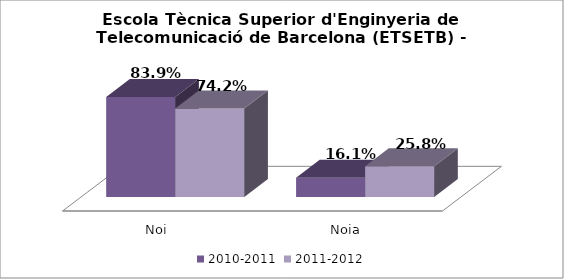
| Category | 2010-2011 | 2011-2012 |
|---|---|---|
| Noi | 0.839 | 0.742 |
| Noia | 0.161 | 0.258 |